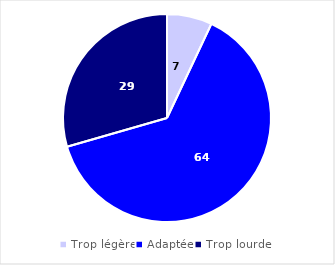
| Category | Series 0 |
|---|---|
| Trop légère | 7.01 |
| Adaptée | 63.54 |
| Trop lourde | 29.45 |